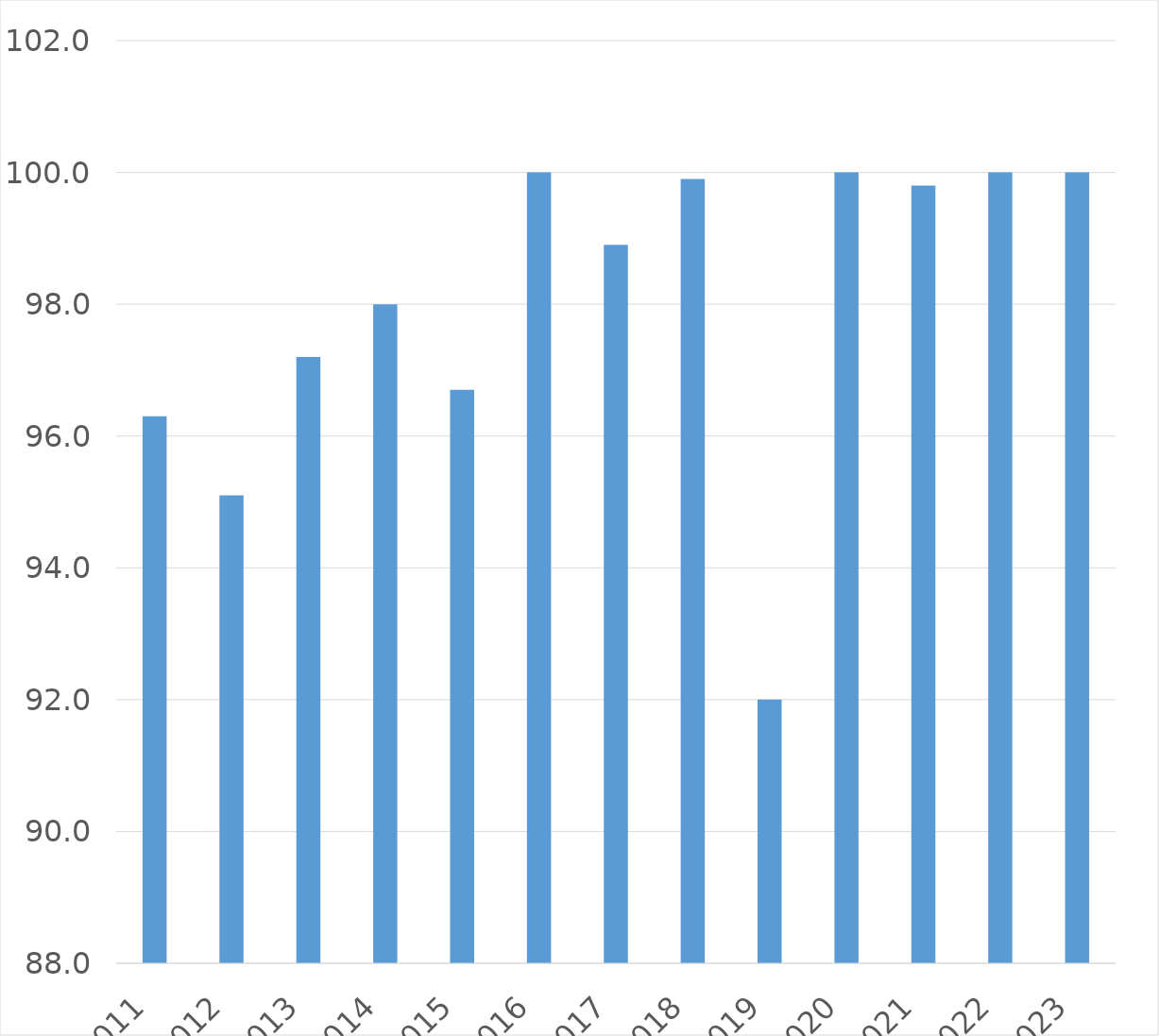
| Category | Series 0 |
|---|---|
| 2011 | 96.3 |
| 2012 | 95.1 |
| 2013 | 97.2 |
| 2014 | 98 |
| 2015 | 96.7 |
| 2016 | 100 |
| 2017 | 98.9 |
| 2018 | 99.9 |
| 2019 | 92 |
| 2020 | 100 |
| 2021 | 99.8 |
| 2022 | 100 |
| 2023 | 100 |